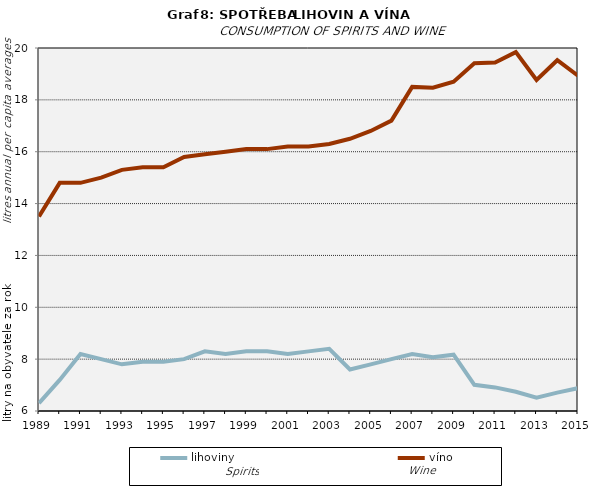
| Category | lihoviny | víno |
|---|---|---|
| 1989.0 | 6.3 | 13.5 |
| 1990.0 | 7.2 | 14.8 |
| 1991.0 | 8.2 | 14.8 |
| 1992.0 | 8 | 15 |
| 1993.0 | 7.8 | 15.3 |
| 1994.0 | 7.9 | 15.4 |
| 1995.0 | 7.9 | 15.4 |
| 1996.0 | 8 | 15.8 |
| 1997.0 | 8.3 | 15.9 |
| 1998.0 | 8.2 | 16 |
| 1999.0 | 8.3 | 16.1 |
| 2000.0 | 8.3 | 16.1 |
| 2001.0 | 8.2 | 16.2 |
| 2002.0 | 8.3 | 16.2 |
| 2003.0 | 8.4 | 16.3 |
| 2004.0 | 7.6 | 16.5 |
| 2005.0 | 7.8 | 16.8 |
| 2006.0 | 8 | 17.2 |
| 2007.0 | 8.2 | 18.5 |
| 2008.0 | 8.07 | 18.47 |
| 2009.0 | 8.17 | 18.7 |
| 2010.0 | 7.01 | 19.41 |
| 2011.0 | 6.91 | 19.44 |
| 2012.0 | 6.74 | 19.84 |
| 2013.0 | 6.51 | 18.77 |
| 2014.0 | 6.71 | 19.53 |
| 2015.0 | 6.88 | 18.93 |